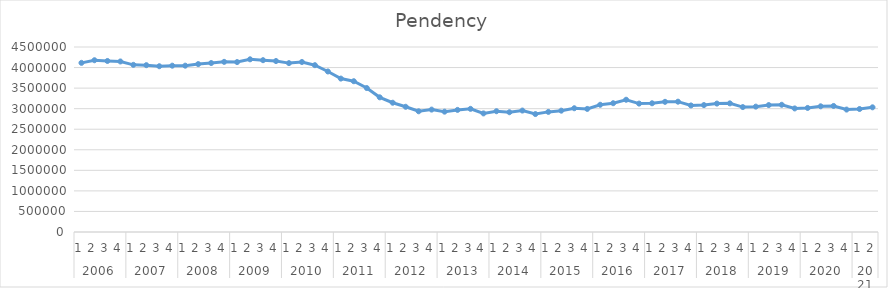
| Category | Pendency |
|---|---|
| 0 | 4114313 |
| 1 | 4178023 |
| 2 | 4160126 |
| 3 | 4148019 |
| 4 | 4066151 |
| 5 | 4057917 |
| 6 | 4032194 |
| 7 | 4045782 |
| 8 | 4046016 |
| 9 | 4083986 |
| 10 | 4110056 |
| 11 | 4138766 |
| 12 | 4133273 |
| 13 | 4200520 |
| 14 | 4179206 |
| 15 | 4158458 |
| 16 | 4108117 |
| 17 | 4135101 |
| 18 | 4057973 |
| 19 | 3904605 |
| 20 | 3731751 |
| 21 | 3667600 |
| 22 | 3501723 |
| 23 | 3275954 |
| 24 | 3144426 |
| 25 | 3045942 |
| 26 | 2936187 |
| 27 | 2977306 |
| 28 | 2927180 |
| 29 | 2970022 |
| 30 | 2995655 |
| 31 | 2884398 |
| 32 | 2937846 |
| 33 | 2913139 |
| 34 | 2953891 |
| 35 | 2868764 |
| 36 | 2921490 |
| 37 | 2951465 |
| 38 | 3010149 |
| 39 | 2994074 |
| 40 | 3094771 |
| 41 | 3132604 |
| 42 | 3217033 |
| 43 | 3123537.587 |
| 44 | 3131207.59 |
| 45 | 3166184.23 |
| 46 | 3170127.416 |
| 47 | 3078140.291 |
| 48 | 3087318.583 |
| 49 | 3123803.512 |
| 50 | 3129254.985 |
| 51 | 3038776.149 |
| 52 | 3049462.73 |
| 53 | 3087455.947 |
| 54 | 3094415.709 |
| 55 | 3005445.161 |
| 56 | 3017640.03 |
| 57 | 3057141.536 |
| 58 | 3065609.587 |
| 59 | 2978147.327 |
| 60 | 2991850.485 |
| 61 | 3032860.279 |